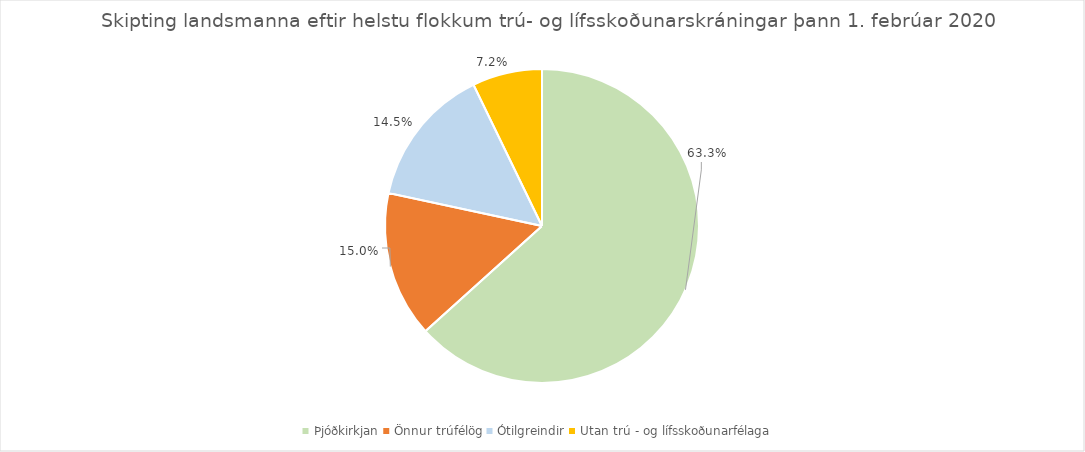
| Category | Series 0 |
|---|---|
| Þjóðkirkjan | 0.633 |
| Önnur trúfélög | 0.15 |
| Ótilgreindir | 0.145 |
| Utan trú - og lífsskoðunarfélaga | 0.072 |